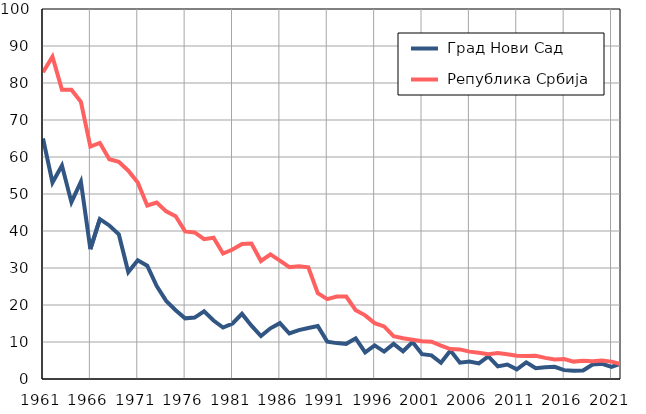
| Category |  Град Нови Сад |  Република Србија |
|---|---|---|
| 1961.0 | 65 | 82.9 |
| 1962.0 | 53.1 | 87.1 |
| 1963.0 | 57.7 | 78.2 |
| 1964.0 | 47.8 | 78.2 |
| 1965.0 | 53.3 | 74.9 |
| 1966.0 | 35.1 | 62.8 |
| 1967.0 | 43.2 | 63.8 |
| 1968.0 | 41.5 | 59.4 |
| 1969.0 | 39.1 | 58.7 |
| 1970.0 | 28.9 | 56.3 |
| 1971.0 | 32.1 | 53.1 |
| 1972.0 | 30.6 | 46.9 |
| 1973.0 | 25.1 | 47.7 |
| 1974.0 | 21.1 | 45.3 |
| 1975.0 | 18.6 | 44 |
| 1976.0 | 16.4 | 39.9 |
| 1977.0 | 16.6 | 39.6 |
| 1978.0 | 18.3 | 37.8 |
| 1979.0 | 15.8 | 38.2 |
| 1980.0 | 13.9 | 33.9 |
| 1981.0 | 15 | 35 |
| 1982.0 | 17.6 | 36.5 |
| 1983.0 | 14.4 | 36.6 |
| 1984.0 | 11.6 | 31.9 |
| 1985.0 | 13.7 | 33.7 |
| 1986.0 | 15.1 | 32 |
| 1987.0 | 12.3 | 30.2 |
| 1988.0 | 13.2 | 30.5 |
| 1989.0 | 13.8 | 30.2 |
| 1990.0 | 14.3 | 23.2 |
| 1991.0 | 10.1 | 21.6 |
| 1992.0 | 9.7 | 22.3 |
| 1993.0 | 9.5 | 22.3 |
| 1994.0 | 11 | 18.6 |
| 1995.0 | 7.2 | 17.2 |
| 1996.0 | 9.1 | 15.1 |
| 1997.0 | 7.4 | 14.2 |
| 1998.0 | 9.5 | 11.6 |
| 1999.0 | 7.5 | 11 |
| 2000.0 | 10 | 10.6 |
| 2001.0 | 6.7 | 10.2 |
| 2002.0 | 6.4 | 10.1 |
| 2003.0 | 4.4 | 9 |
| 2004.0 | 7.7 | 8.1 |
| 2005.0 | 4.4 | 8 |
| 2006.0 | 4.7 | 7.4 |
| 2007.0 | 4.2 | 7.1 |
| 2008.0 | 6.1 | 6.7 |
| 2009.0 | 3.4 | 7 |
| 2010.0 | 3.9 | 6.7 |
| 2011.0 | 2.6 | 6.3 |
| 2012.0 | 4.5 | 6.2 |
| 2013.0 | 2.9 | 6.3 |
| 2014.0 | 3.2 | 5.7 |
| 2015.0 | 3.3 | 5.3 |
| 2016.0 | 2.4 | 5.4 |
| 2017.0 | 2.2 | 4.7 |
| 2018.0 | 2.3 | 4.9 |
| 2019.0 | 3.9 | 4.8 |
| 2020.0 | 4.1 | 5 |
| 2021.0 | 3.3 | 4.7 |
| 2022.0 | 4.2 | 4 |